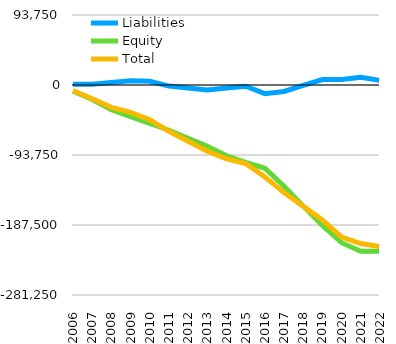
| Category | Liabilities  | Equity  | Total  |
|---|---|---|---|
| 2006 | 1008.1 | -8390.9 | -7382.8 |
| 2007 | 1016 | -19355.8 | -18339.8 |
| 2008 | 3283.4 | -33209.2 | -29925.8 |
| 2009 | 5730.4 | -42405.1 | -36674.7 |
| 2010 | 4952.8 | -51447.1 | -46494.3 |
| 2011 | -1484.2 | -60549.1 | -62033.3 |
| 2012 | -4064.2 | -71283.1 | -75347.3 |
| 2013 | -6715.2 | -81959.1 | -88674.3 |
| 2014 | -3911.2 | -94846.1 | -98757.3 |
| 2015 | -1608.2 | -103556.1 | -105164.3 |
| 2016 | -11559.2 | -111510.1 | -123069.3 |
| 2017 | -8628.2 | -135493.1 | -144121.3 |
| 2018 | -343.2 | -162236.1 | -162579.3 |
| 2019 | 7326.8 | -188153.1 | -180826.3 |
| 2020 | 7415.8 | -211193.1 | -203777.3 |
| 2021 | 10287.8 | -222615.1 | -212327.3 |
| 2022 | 6059.8 | -222570.1 | -216510.3 |